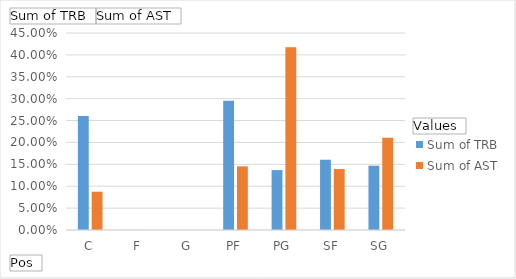
| Category | Sum of TRB | Sum of AST |
|---|---|---|
| C | 0.26 | 0.087 |
| F | 0 | 0 |
| G | 0 | 0 |
| PF | 0.295 | 0.145 |
| PG | 0.137 | 0.417 |
| SF | 0.161 | 0.139 |
| SG | 0.147 | 0.211 |